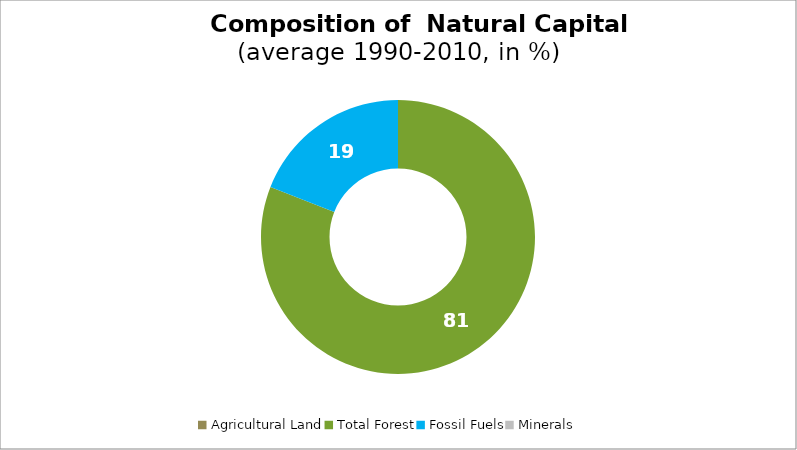
| Category | Series 0 |
|---|---|
| Agricultural Land | 0 |
| Total Forest | 80.953 |
| Fossil Fuels | 19.047 |
| Minerals | 0 |